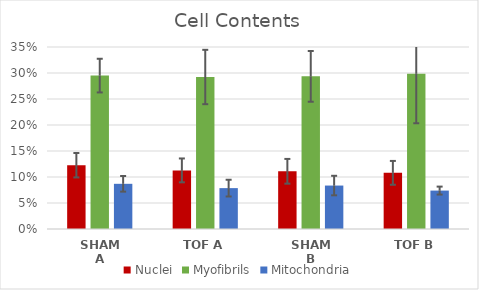
| Category | Nuclei | Myofibrils | Mitochondria |
|---|---|---|---|
| SHAM A | 0.123 | 0.295 | 0.087 |
| TOF A | 0.113 | 0.292 | 0.079 |
| SHAM B | 0.111 | 0.294 | 0.084 |
| TOF B | 0.108 | 0.298 | 0.074 |